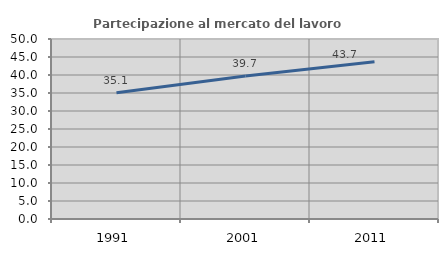
| Category | Partecipazione al mercato del lavoro  femminile |
|---|---|
| 1991.0 | 35.096 |
| 2001.0 | 39.743 |
| 2011.0 | 43.658 |